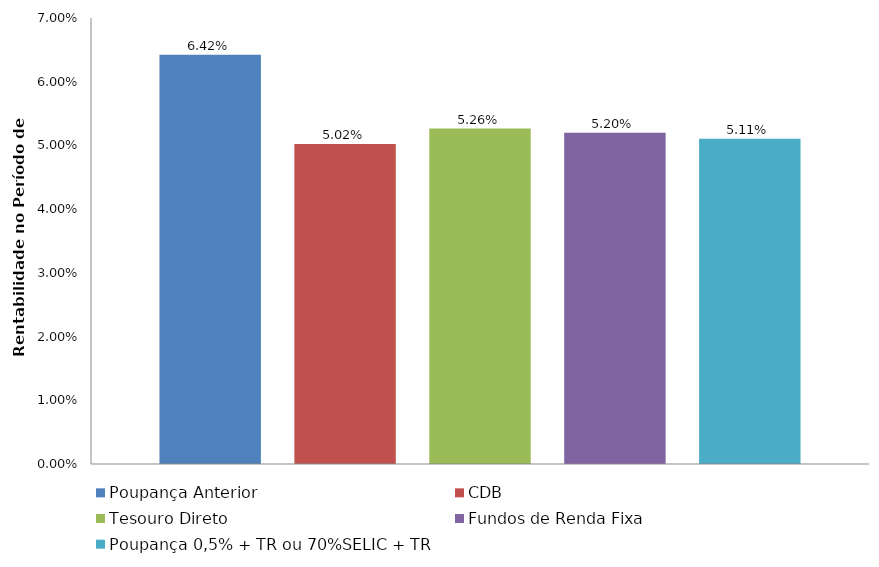
| Category | Poupança Anterior | CDB | Tesouro Direto | Fundos de Renda Fixa | Poupança 0,5% + TR ou 70%SELIC + TR |
|---|---|---|---|---|---|
| Poupança Anterior | 0.064 | 0.05 | 0.053 | 0.052 | 0.051 |